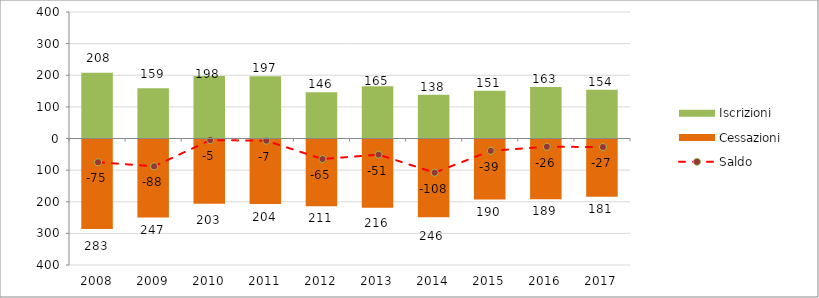
| Category | Iscrizioni | Cessazioni |
|---|---|---|
| 2008.0 | 208 | -283 |
| 2009.0 | 159 | -247 |
| 2010.0 | 198 | -203 |
| 2011.0 | 197 | -204 |
| 2012.0 | 146 | -211 |
| 2013.0 | 165 | -216 |
| 2014.0 | 138 | -246 |
| 2015.0 | 151 | -190 |
| 2016.0 | 163 | -189 |
| 2017.0 | 154 | -181 |